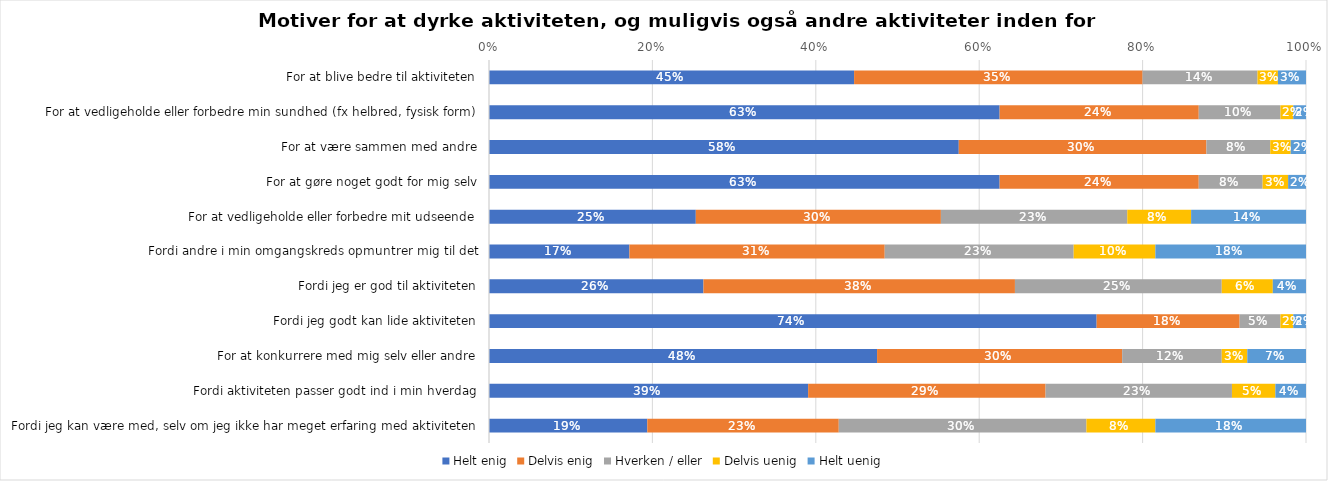
| Category | Helt enig | Delvis enig | Hverken / eller | Delvis uenig | Helt uenig |
|---|---|---|---|---|---|
| For at blive bedre til aktiviteten | 0.447 | 0.353 | 0.141 | 0.025 | 0.034 |
| For at vedligeholde eller forbedre min sundhed (fx helbred, fysisk form) | 0.625 | 0.244 | 0.1 | 0.016 | 0.016 |
| For at være sammen med andre | 0.575 | 0.303 | 0.078 | 0.025 | 0.019 |
| For at gøre noget godt for mig selv | 0.625 | 0.244 | 0.078 | 0.031 | 0.022 |
| For at vedligeholde eller forbedre mit udseende | 0.253 | 0.3 | 0.228 | 0.078 | 0.141 |
| Fordi andre i min omgangskreds opmuntrer mig til det | 0.172 | 0.312 | 0.231 | 0.1 | 0.184 |
| Fordi jeg er god til aktiviteten | 0.262 | 0.381 | 0.253 | 0.062 | 0.041 |
| Fordi jeg godt kan lide aktiviteten | 0.744 | 0.175 | 0.05 | 0.016 | 0.016 |
| For at konkurrere med mig selv eller andre | 0.475 | 0.3 | 0.122 | 0.031 | 0.072 |
| Fordi aktiviteten passer godt ind i min hverdag | 0.391 | 0.291 | 0.228 | 0.053 | 0.038 |
| Fordi jeg kan være med, selv om jeg ikke har meget erfaring med aktiviteten | 0.194 | 0.234 | 0.303 | 0.084 | 0.184 |